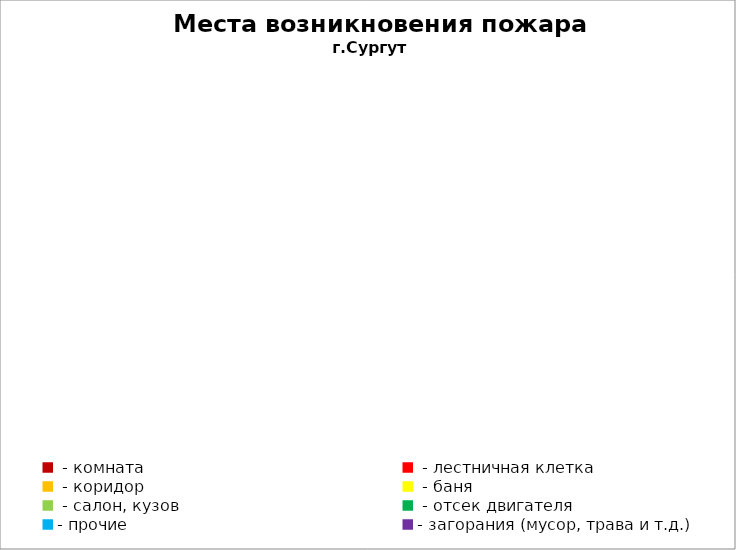
| Category | Места возникновения пожара |
|---|---|
|  - комната | 17 |
|  - лестничная клетка | 2 |
|  - коридор | 5 |
|  - баня | 3 |
|  - салон, кузов | 7 |
|  - отсек двигателя | 24 |
| - прочие | 59 |
| - загорания (мусор, трава и т.д.)  | 25 |